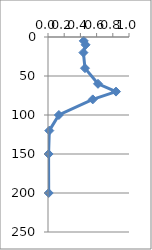
| Category | Series 0 |
|---|---|
| 0.4416129119999999 | 5 |
| 0.4638609119999999 | 10 |
| 0.43716331199999986 | 20 |
| 0.4564449119999999 | 40 |
| 0.6171249119999999 | 60 |
| 0.839604912 | 70 |
| 0.552852912 | 80 |
| 0.134096112 | 100 |
| 0.016181712 | 120 |
| 0.007183631999999999 | 150 |
| 0.008617391999999998 | 200 |